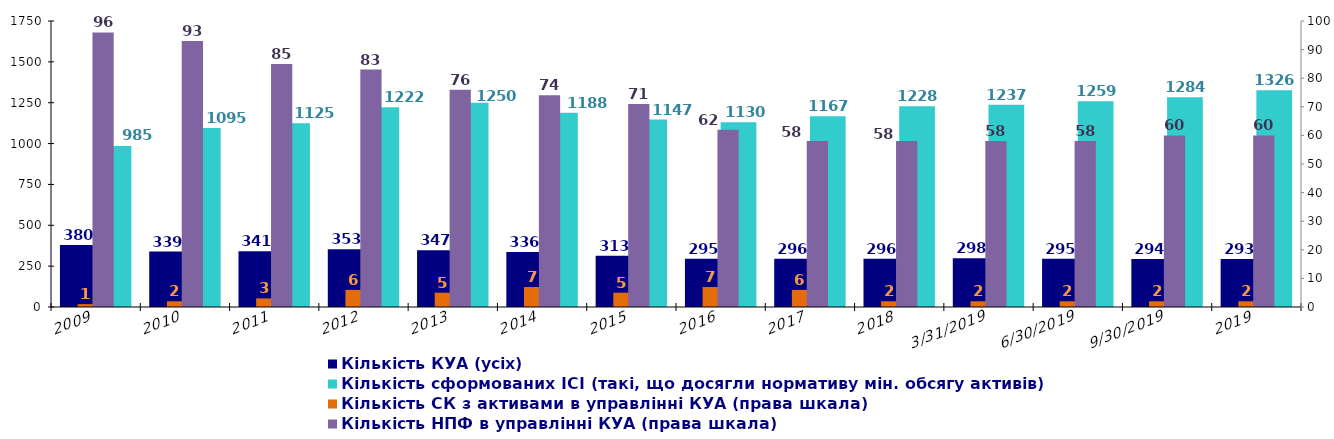
| Category | Кількість зареєстрованих ІСІ на одну КУА | Кількість КУА (усіх) | Кількість КУА з ІСІ в управлінні | Кількість сформованих ІСІ (такі, що досягли нормативу мін. обсягу активів)  |
|---|---|---|---|---|
| 2009 |  | 380 |  | 985 |
| 2010 |  | 339 |  | 1095 |
| 2011 |  | 341 |  | 1125 |
| 2012 |  | 353 |  | 1222 |
| 2013 |  | 347 |  | 1250 |
| 2014 |  | 336 |  | 1188 |
| 2015 |  | 313 |  | 1147 |
| 2016 |  | 295 |  | 1130 |
| 2017 |  | 296 |  | 1167 |
| 2018 |  | 296 |  | 1228 |
| 31.03.2019 |  | 298 |  | 1237 |
| 30.06.2019 |  | 295 |  | 1259 |
| 30.09.2019 |  | 294 |  | 1284 |
| 2019 |  | 293 |  | 1326 |